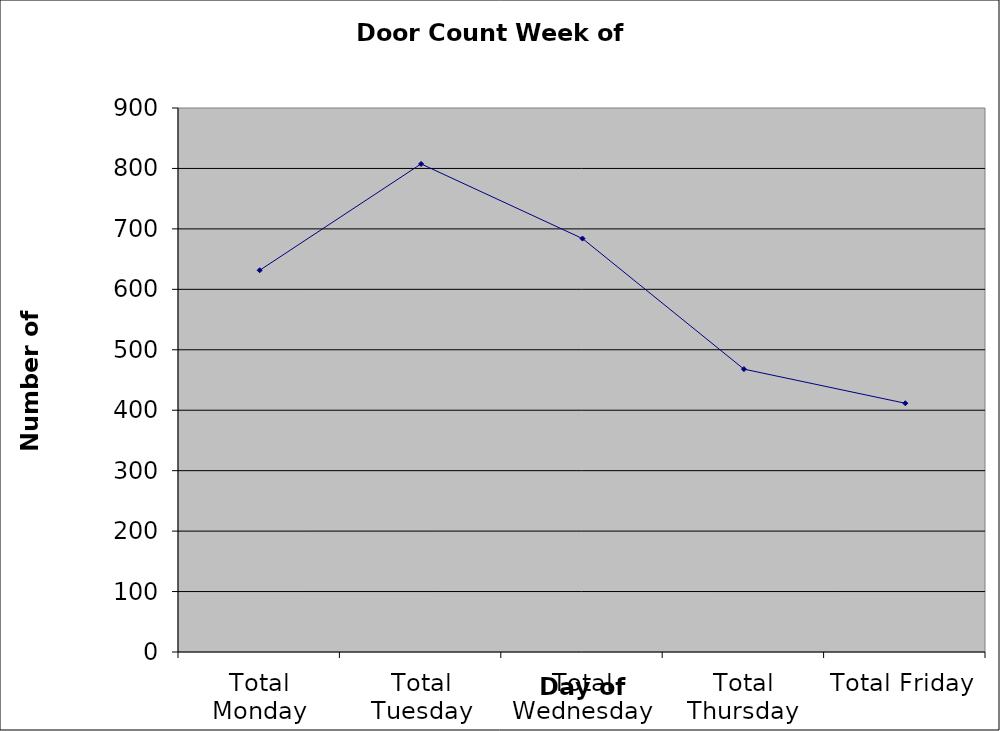
| Category | Series 0 |
|---|---|
| Total Monday | 631.5 |
| Total Tuesday | 807.5 |
| Total Wednesday | 684 |
| Total Thursday | 468 |
| Total Friday | 411.5 |